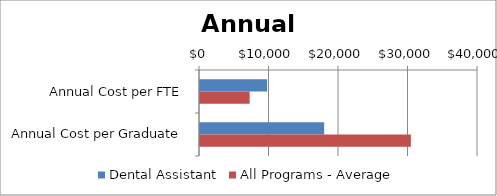
| Category | Dental Assistant | All Programs - Average |
|---|---|---|
| Annual Cost per FTE | 9655.908 | 7144 |
| Annual Cost per Graduate | 17863.43 | 30340 |